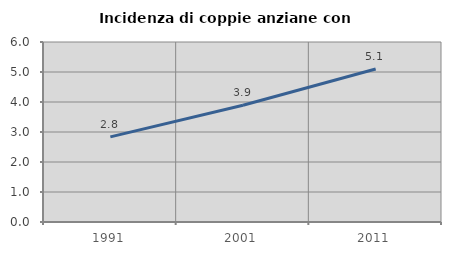
| Category | Incidenza di coppie anziane con figli |
|---|---|
| 1991.0 | 2.837 |
| 2001.0 | 3.891 |
| 2011.0 | 5.1 |